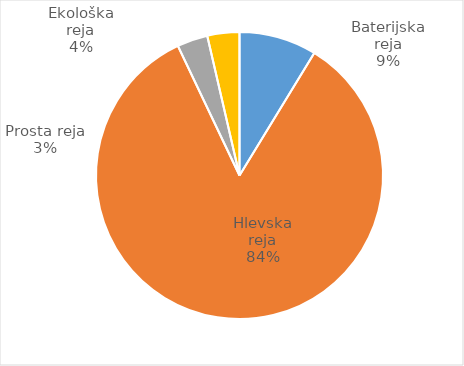
| Category | Število kosov jajc |
|---|---|
| Baterijska reja | 295081 |
| Hlevska reja | 2849609 |
| Prosta reja | 116859 |
| Ekološka reja | 122200 |